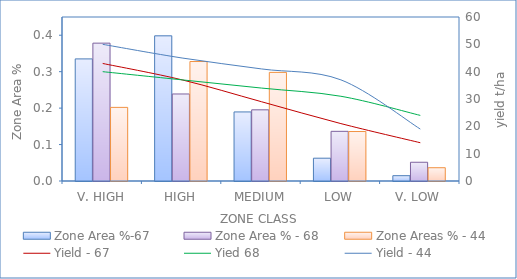
| Category | Zone Area %-67 | Zone Area % - 68 | Zone Areas % - 44 |
|---|---|---|---|
| V. HIGH | 0.335 | 0.378 | 0.202 |
| HIGH | 0.398 | 0.239 | 0.328 |
| MEDIUM | 0.19 | 0.195 | 0.298 |
| LOW | 0.063 | 0.136 | 0.136 |
| V. LOW | 0.015 | 0.051 | 0.036 |